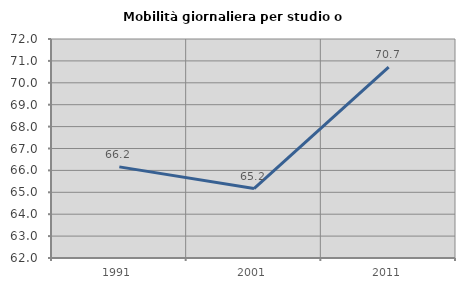
| Category | Mobilità giornaliera per studio o lavoro |
|---|---|
| 1991.0 | 66.161 |
| 2001.0 | 65.17 |
| 2011.0 | 70.719 |